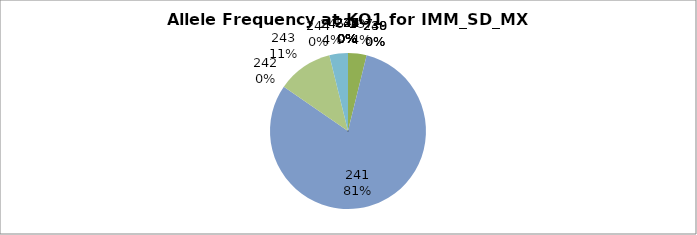
| Category | Series 0 |
|---|---|
| 221.0 | 0 |
| 227.0 | 0 |
| 231.0 | 0 |
| 232.0 | 0 |
| 233.0 | 0 |
| 234.0 | 0 |
| 235.0 | 0 |
| 236.0 | 0 |
| 237.0 | 0.038 |
| 238.0 | 0 |
| 239.0 | 0 |
| 240.0 | 0 |
| 241.0 | 0.808 |
| 242.0 | 0 |
| 243.0 | 0.115 |
| 244.0 | 0 |
| 245.0 | 0.038 |
| 247.0 | 0 |
| 249.0 | 0 |